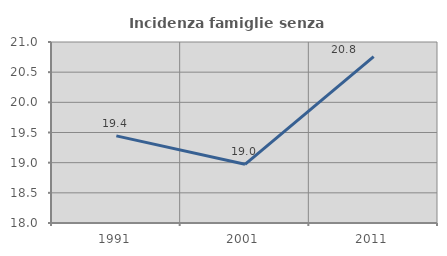
| Category | Incidenza famiglie senza nuclei |
|---|---|
| 1991.0 | 19.445 |
| 2001.0 | 18.973 |
| 2011.0 | 20.757 |